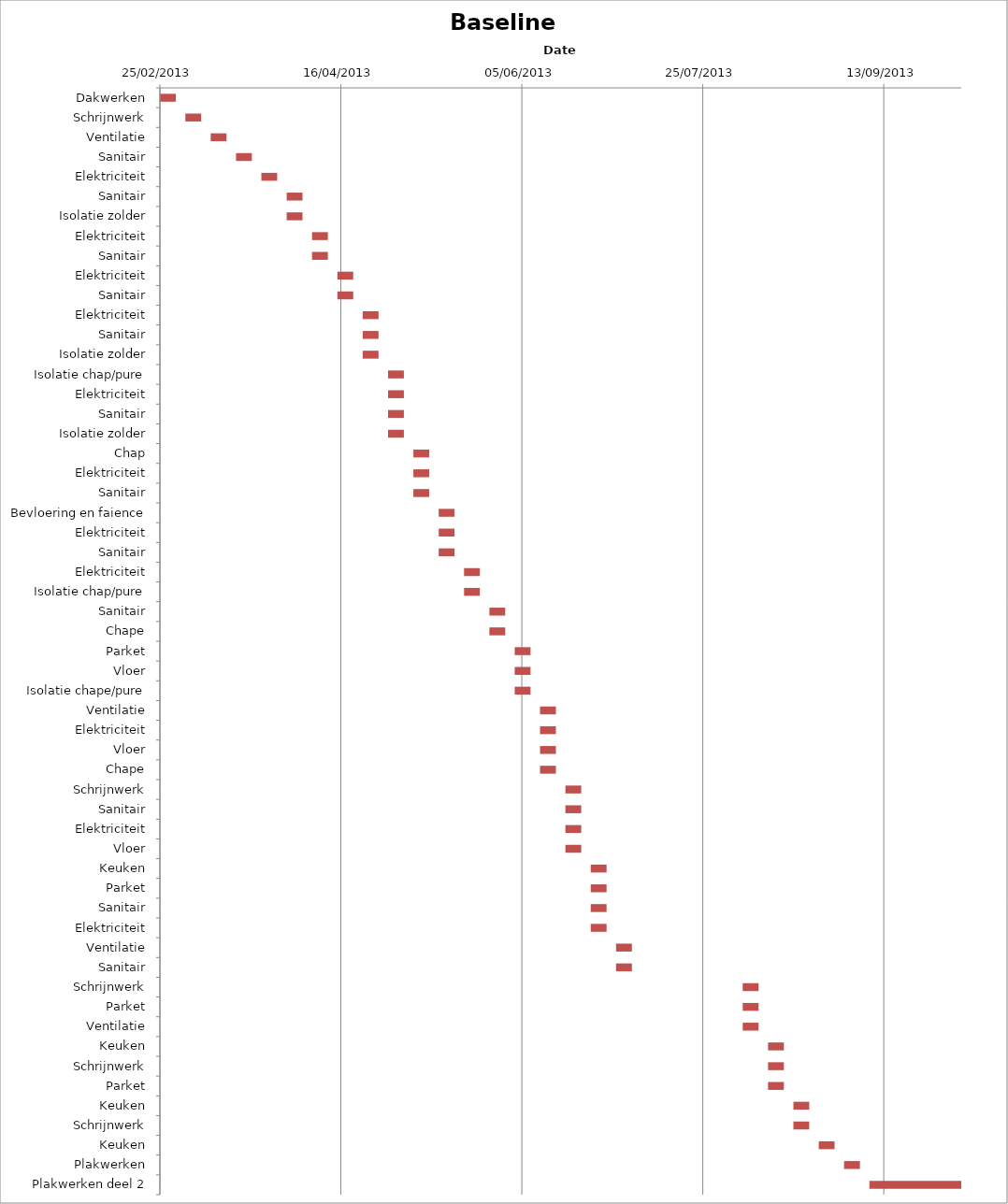
| Category | Baseline start | Actual duration |
|---|---|---|
| Dakwerken | 41330.333 | 4.375 |
| Schrijnwerk | 41337.333 | 4.375 |
| Ventilatie | 41344.333 | 4.375 |
| Sanitair | 41351.333 | 4.375 |
| Elektriciteit | 41358.333 | 4.375 |
| Sanitair | 41365.333 | 4.375 |
| Isolatie zolder | 41365.333 | 4.375 |
| Elektriciteit | 41372.333 | 4.375 |
| Sanitair | 41372.333 | 4.375 |
| Elektriciteit | 41379.333 | 4.375 |
| Sanitair | 41379.333 | 4.375 |
| Elektriciteit | 41386.333 | 4.375 |
| Sanitair | 41386.333 | 4.375 |
| Isolatie zolder | 41386.333 | 4.375 |
| Isolatie chap/pure | 41393.333 | 4.375 |
| Elektriciteit | 41393.333 | 4.375 |
| Sanitair | 41393.333 | 4.375 |
| Isolatie zolder | 41393.333 | 4.375 |
| Chap | 41400.333 | 4.375 |
| Elektriciteit | 41400.333 | 4.375 |
| Sanitair | 41400.333 | 4.375 |
| Bevloering en faience | 41407.333 | 4.375 |
| Elektriciteit | 41407.333 | 4.375 |
| Sanitair | 41407.333 | 4.375 |
| Elektriciteit | 41414.333 | 4.375 |
| Isolatie chap/pure | 41414.333 | 4.375 |
| Sanitair | 41421.333 | 4.375 |
| Chape | 41421.333 | 4.375 |
| Parket | 41428.333 | 4.375 |
| Vloer | 41428.333 | 4.375 |
| Isolatie chape/pure | 41428.333 | 4.375 |
| Ventilatie | 41435.333 | 4.375 |
| Elektriciteit | 41435.333 | 4.375 |
| Vloer | 41435.333 | 4.375 |
| Chape | 41435.333 | 4.375 |
| Schrijnwerk | 41442.333 | 4.375 |
| Sanitair | 41442.333 | 4.375 |
| Elektriciteit | 41442.333 | 4.375 |
| Vloer | 41442.333 | 4.375 |
| Keuken | 41449.333 | 4.375 |
| Parket | 41449.333 | 4.375 |
| Sanitair | 41449.333 | 4.375 |
| Elektriciteit | 41449.333 | 4.375 |
| Ventilatie | 41456.333 | 4.375 |
| Sanitair | 41456.333 | 4.375 |
| Schrijnwerk | 41491.333 | 4.375 |
| Parket | 41491.333 | 4.375 |
| Ventilatie | 41491.333 | 4.375 |
| Keuken | 41498.333 | 4.375 |
| Schrijnwerk | 41498.333 | 4.375 |
| Parket | 41498.333 | 4.375 |
| Keuken | 41505.333 | 4.375 |
| Schrijnwerk | 41505.333 | 4.375 |
| Keuken | 41512.333 | 4.375 |
| Plakwerken | 41519.333 | 4.375 |
| Plakwerken deel 2 | 41526.333 | 25.375 |